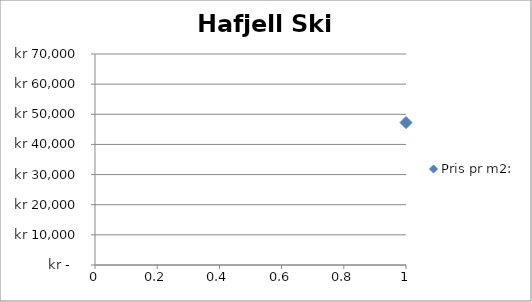
| Category | Pris pr m2: |
|---|---|
| 0 | 47253 |
| 1 | 31579 |
| 2 | 34052 |
| 3 | 36905 |
| 4 | 45455 |
| 5 | 32979 |
| 6 | 36111 |
| 7 | 45263 |
| 8 | 34496 |
| 9 | 35915 |
| 10 | 29921 |
| 11 | 43046 |
| 12 | 33333 |
| 13 | 42373 |
| 14 | 29126 |
| 15 | 45385 |
| 16 | 29000 |
| 17 | 31250 |
| 18 | 33482 |
| 19 | 35283 |
| 20 | 26126 |
| 21 | 45679 |
| 22 | 42553 |
| 23 | 41490 |
| 24 | 33929 |
| 25 | 33421 |
| 26 | 35091 |
| 27 | 37706 |
| 28 | 35238 |
| 29 | 31126 |
| 30 | 58182 |
| 31 | 29664 |
| 32 | 36397 |
| 33 | 37879 |
| 34 | 28800 |
| 35 | 33051 |
| 36 | 31579 |
| 37 | 13761 |
| 38 | 21212 |
| 39 | 35275 |
| 40 | 35789 |
| 41 | 41259 |
| 42 | 25595 |
| 43 | 32075 |
| 44 | 39744 |
| 45 | 45929 |
| 46 | 34143 |
| 47 | 35000 |
| 48 | 28523 |
| 49 | 42192 |
| 50 | 42949 |
| 51 | 47500 |
| 52 | 24789 |
| 53 | 43878 |
| 54 | 39881 |
| 55 | 34364 |
| 56 | 32759 |
| 57 | 30508 |
| 58 | 53125 |
| 59 | 55313 |
| 60 | 22938 |
| 61 | 34375 |
| 62 | 33803 |
| 63 | 37356 |
| 64 | 33509 |
| 65 | 43250 |
| 66 | 35921 |
| 67 | 43878 |
| 68 | 35915 |
| 69 | 45238 |
| 70 | 29907 |
| 71 | 37288 |
| 72 | 47761 |
| 73 | 26838 |
| 74 | 53125 |
| 75 | 29545 |
| 76 | 44355 |
| 77 | 34333 |
| 78 | 30952 |
| 79 | 33028 |
| 80 | 28846 |
| 81 | 32927 |
| 82 | 38559 |
| 83 | 27778 |
| 84 | 32099 |
| 85 | 40860 |
| 86 | 43750 |
| 87 | 42679 |
| 88 | 25888 |
| 89 | 21239 |
| 90 | 36111 |
| 91 | 35632 |
| 92 | 31928 |
| 93 | 35000 |
| 94 | 25843 |
| 95 | 39394 |
| 96 | 28881 |
| 97 | 38272 |
| 98 | 46512 |
| 99 | 39189 |
| 100 | 36207 |
| 101 | 24138 |
| 102 | 44086 |
| 103 | 39870 |
| 104 | 32727 |
| 105 | 26195 |
| 106 | 30909 |
| 107 | 29358 |
| 108 | 31410 |
| 109 | 37580 |
| 110 | 34568 |
| 111 | 26087 |
| 112 | 37500 |
| 113 | 44915 |
| 114 | 42361 |
| 115 | 15044 |
| 116 | 39786 |
| 117 | 32895 |
| 118 | 35039 |
| 119 | 37740 |
| 120 | 59211 |
| 121 | 39634 |
| 122 | 42544 |
| 123 | 50794 |
| 124 | 34324 |
| 125 | 27670 |
| 126 | 33854 |
| 127 | 36842 |
| 128 | 28488 |
| 129 | 29936 |
| 130 | 32895 |
| 131 | 33537 |
| 132 | 32982 |
| 133 | 38182 |
| 134 | 38037 |
| 135 | 32143 |
| 136 | 38816 |
| 137 | 51282 |
| 138 | 31579 |
| 139 | 36697 |
| 140 | 42149 |
| 141 | 39231 |
| 142 | 36869 |
| 143 | 31019 |
| 144 | 46250 |
| 145 | 37857 |
| 146 | 16071 |
| 147 | 40625 |
| 148 | 37079 |
| 149 | 29455 |
| 150 | 29455 |
| 151 | 35965 |
| 152 | 32716 |
| 153 | 37654 |
| 154 | 27966 |
| 155 | 35625 |
| 156 | 41379 |
| 157 | 40000 |
| 158 | 31443 |
| 159 | 38182 |
| 160 | 30675 |
| 161 | 37143 |
| 162 | 24790 |
| 163 | 30251 |
| 164 | 40000 |
| 165 | 19497 |
| 166 | 39252 |
| 167 | 33072 |
| 168 | 34196 |
| 169 | 39815 |
| 170 | 18182 |
| 171 | 18182 |
| 172 | 18182 |
| 173 | 18182 |
| 174 | 18182 |
| 175 | 18182 |
| 176 | 18868 |
| 177 | 18868 |
| 178 | 18868 |
| 179 | 28049 |
| 180 | 40714 |
| 181 | 31132 |
| 182 | 42000 |
| 183 | 21018 |
| 184 | 29630 |
| 185 | 32456 |
| 186 | 32710 |
| 187 | 25870 |
| 188 | 17323 |
| 189 | 39286 |
| 190 | 27523 |
| 191 | 40000 |
| 192 | 31982 |
| 193 | 34513 |
| 194 | 39437 |
| 195 | 38525 |
| 196 | 27397 |
| 197 | 26214 |
| 198 | 38816 |
| 199 | 41060 |
| 200 | 44318 |
| 201 | 29098 |
| 202 | 38525 |